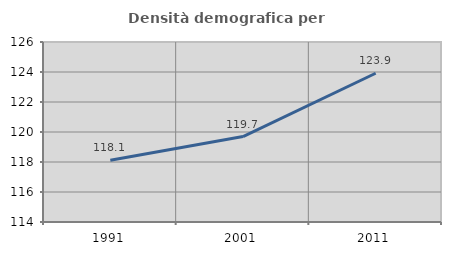
| Category | Densità demografica |
|---|---|
| 1991.0 | 118.116 |
| 2001.0 | 119.698 |
| 2011.0 | 123.917 |